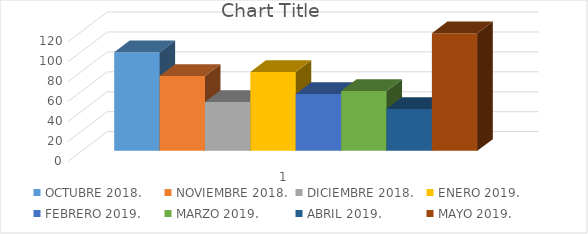
| Category | OCTUBRE 2018. | NOVIEMBRE 2018. | DICIEMBRE 2018. | ENERO 2019. | FEBRERO 2019. | MARZO 2019. | ABRIL 2019. | MAYO 2019. |
|---|---|---|---|---|---|---|---|---|
| 0 | 99 | 75 | 49 | 79 | 57 | 60 | 42 | 118 |